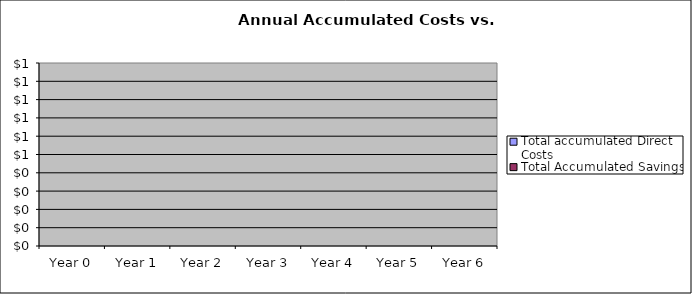
| Category | Total accumulated Direct Costs | Total Accumulated Savings |
|---|---|---|
| Year 0 | 0 | 0 |
| Year 1 | 0 | 0 |
| Year 2 | 0 | 0 |
| Year 3 | 0 | 0 |
| Year 4 | 0 | 0 |
| Year 5 | 0 | 0 |
| Year 6 | 0 | 0 |